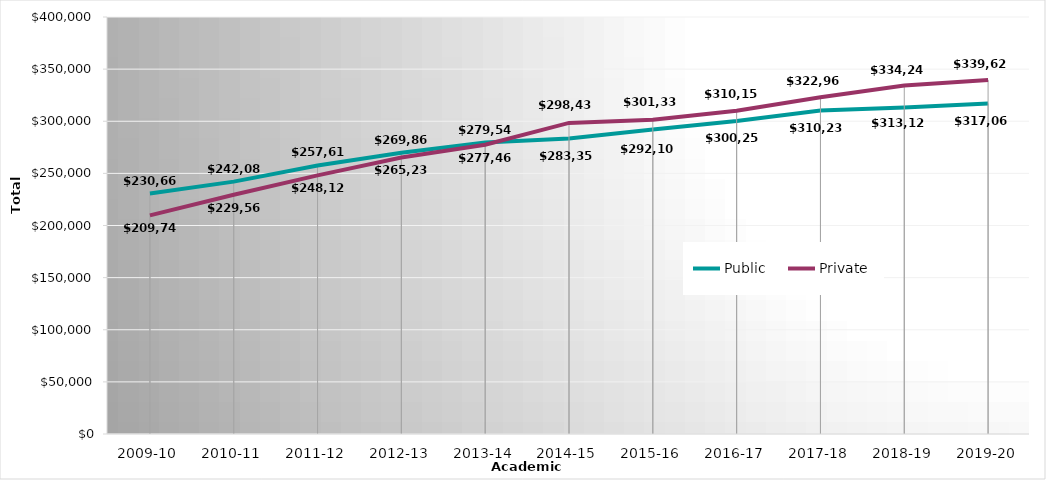
| Category | Public | Private |
|---|---|---|
| 2009-10 | 230665 | 209744 |
| 2010-11 | 242081 | 229560 |
| 2011-12 | 257614 | 248129 |
| 2012-13 | 269868 | 265237 |
| 2013-14 | 279547 | 277463 |
| 2014-15 | 283356 | 298438 |
| 2015-16 | 292103.97 | 301337.21 |
| 2016-17 | 300252.49 | 310151.65 |
| 2017-18 | 310229.56 | 322960.58 |
| 2018-19 | 313129.36 | 334242.27 |
| 2019-20 | 317062.1 | 339627.93 |